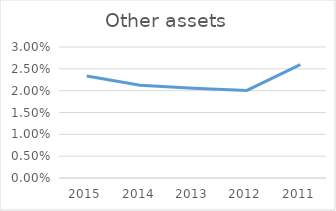
| Category | Other assets |
|---|---|
| 2015.0 | 0.023 |
| 2014.0 | 0.021 |
| 2013.0 | 0.021 |
| 2012.0 | 0.02 |
| 2011.0 | 0.026 |